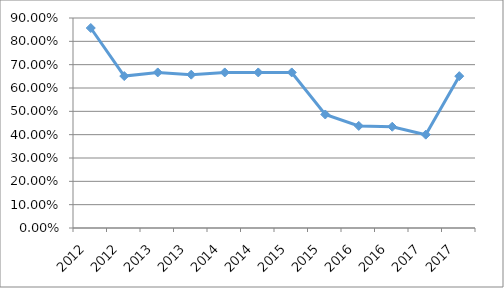
| Category | LOAL-I2O43 |
|---|---|
| 2012.0 | 0.857 |
| 2012.0 | 0.651 |
| 2013.0 | 0.667 |
| 2013.0 | 0.657 |
| 2014.0 | 0.667 |
| 2014.0 | 0.667 |
| 2015.0 | 0.667 |
| 2015.0 | 0.486 |
| 2016.0 | 0.438 |
| 2016.0 | 0.434 |
| 2017.0 | 0.4 |
| 2017.0 | 0.651 |